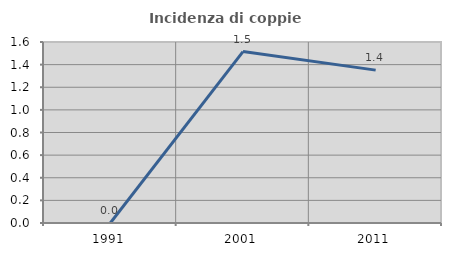
| Category | Incidenza di coppie miste |
|---|---|
| 1991.0 | 0 |
| 2001.0 | 1.515 |
| 2011.0 | 1.351 |